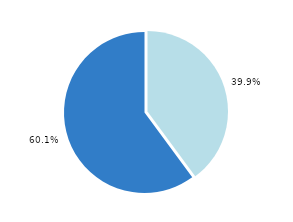
| Category | Series 0 |
|---|---|
| 0 | 3324 |
| 1 | 5007 |